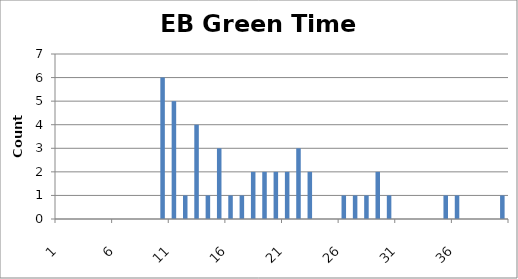
| Category | Series 0 |
|---|---|
| 0 | 0 |
| 1 | 0 |
| 2 | 0 |
| 3 | 0 |
| 4 | 0 |
| 5 | 0 |
| 6 | 0 |
| 7 | 0 |
| 8 | 0 |
| 9 | 6 |
| 10 | 5 |
| 11 | 1 |
| 12 | 4 |
| 13 | 1 |
| 14 | 3 |
| 15 | 1 |
| 16 | 1 |
| 17 | 2 |
| 18 | 2 |
| 19 | 2 |
| 20 | 2 |
| 21 | 3 |
| 22 | 2 |
| 23 | 0 |
| 24 | 0 |
| 25 | 1 |
| 26 | 1 |
| 27 | 1 |
| 28 | 2 |
| 29 | 1 |
| 30 | 0 |
| 31 | 0 |
| 32 | 0 |
| 33 | 0 |
| 34 | 1 |
| 35 | 1 |
| 36 | 0 |
| 37 | 0 |
| 38 | 0 |
| 39 | 1 |